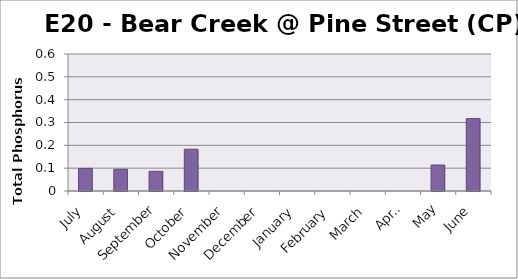
| Category | Phosphorus (mg/L) |
|---|---|
| July | 0.099 |
| August | 0.095 |
| September | 0.086 |
| October | 0.183 |
| November | 0 |
| December | 0 |
| January | 0 |
| February | 0 |
| March | 0 |
| April | 0 |
| May | 0.114 |
| June | 0.317 |